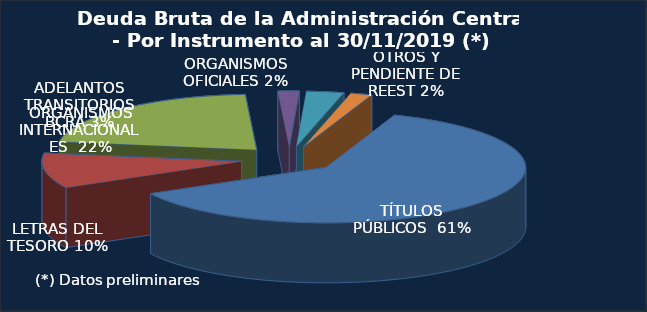
| Category | Series 0 |
|---|---|
| TÍTULOS PÚBLICOS | 191685.9 |
| LETRAS DEL TESORO | 31829.4 |
| ORGANISMOS INTERNACIONALES | 67650.7 |
| ORGANISMOS OFICIALES | 5328.7 |
| ADELANTOS TRANSITORIOS BCRA | 9400.3 |
| OTROS Y PENDIENTE DE REEST. | 5391.6 |